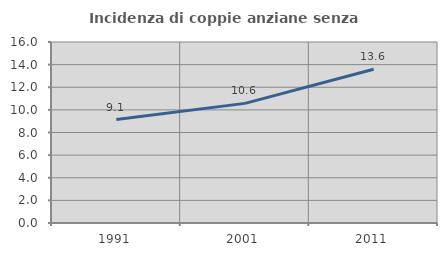
| Category | Incidenza di coppie anziane senza figli  |
|---|---|
| 1991.0 | 9.14 |
| 2001.0 | 10.575 |
| 2011.0 | 13.594 |